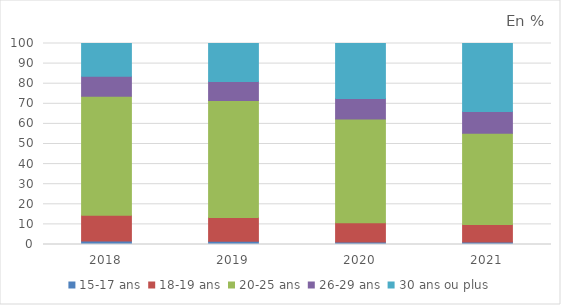
| Category | 15-17 ans | 18-19 ans | 20-25 ans | 26-29 ans | 30 ans ou plus |
|---|---|---|---|---|---|
| 2018.0 | 1.7 | 12.8 | 59.2 | 10 | 16.3 |
| 2019.0 | 1.6 | 11.8 | 58.2 | 9.5 | 18.9 |
| 2020.0 | 1.2 | 9.6 | 51.7 | 10.1 | 27.4 |
| 2021.0 | 1.2 | 8.8 | 45.3 | 10.9 | 33.8 |